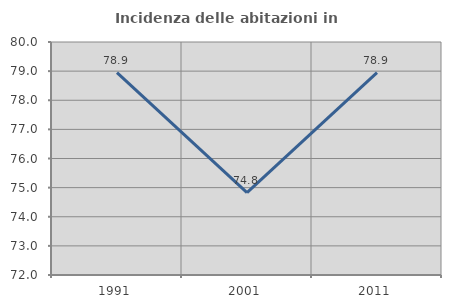
| Category | Incidenza delle abitazioni in proprietà  |
|---|---|
| 1991.0 | 78.947 |
| 2001.0 | 74.83 |
| 2011.0 | 78.947 |